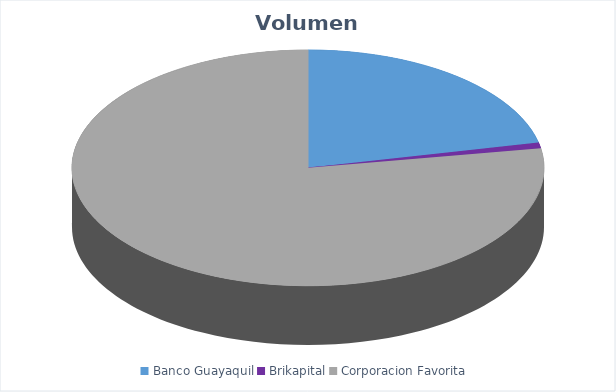
| Category | VOLUMEN ($USD) |
|---|---|
| Banco Guayaquil | 80000 |
| Brikapital | 3000 |
| Corporacion Favorita | 288243.55 |